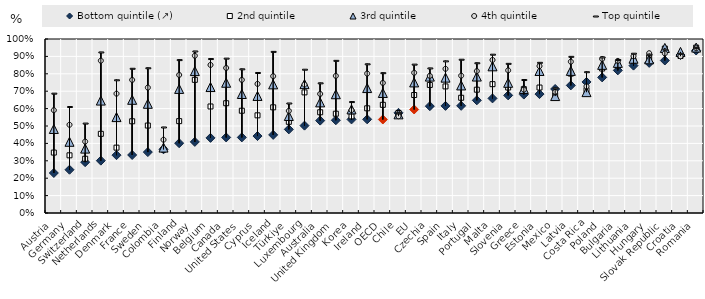
| Category | Bottom quintile (↗) | 2nd quintile | 3rd quintile | 4th quintile | Top quintile |
|---|---|---|---|---|---|
| Austria | 0.23 | 0.347 | 0.483 | 0.591 | 0.689 |
| Germany | 0.249 | 0.331 | 0.409 | 0.507 | 0.612 |
| Switzerland | 0.292 | 0.312 | 0.37 | 0.411 | 0.517 |
| Netherlands | 0.301 | 0.455 | 0.646 | 0.875 | 0.925 |
| Denmark | 0.332 | 0.376 | 0.551 | 0.686 | 0.766 |
| France | 0.333 | 0.527 | 0.651 | 0.765 | 0.832 |
| Sweden | 0.35 | 0.503 | 0.628 | 0.721 | 0.835 |
| Colombia | 0.366 | 0.365 | 0.376 | 0.421 | 0.494 |
| Finland | 0.401 | 0.528 | 0.713 | 0.794 | 0.882 |
| Norway | 0.409 | 0.765 | 0.816 | 0.904 | 0.931 |
| Belgium | 0.432 | 0.612 | 0.724 | 0.851 | 0.888 |
| Canada | 0.434 | 0.631 | 0.749 | 0.834 | 0.89 |
| United States | 0.434 | 0.588 | 0.684 | 0.765 | 0.829 |
| Cyprus | 0.442 | 0.561 | 0.673 | 0.742 | 0.808 |
| Iceland | 0.449 | 0.607 | 0.739 | 0.786 | 0.929 |
| Türkiye | 0.481 | 0.524 | 0.558 | 0.587 | 0.632 |
| Luxembourg | 0.502 | 0.693 | 0.741 | 0.738 | 0.826 |
| Australia | 0.531 | 0.579 | 0.636 | 0.684 | 0.748 |
| United Kingdom | 0.533 | 0.571 | 0.683 | 0.788 | 0.877 |
| Korea | 0.538 | 0.555 | 0.595 | 0.591 | 0.64 |
| Ireland | 0.538 | 0.602 | 0.718 | 0.801 | 0.857 |
| OECD | 0.537 | 0.622 | 0.69 | 0.748 | 0.806 |
| Chile | 0.576 | 0.575 | 0.567 | 0.556 | 0.576 |
| EU | 0.595 | 0.678 | 0.75 | 0.806 | 0.856 |
| Czechia | 0.614 | 0.736 | 0.784 | 0.788 | 0.834 |
| Spain | 0.616 | 0.727 | 0.778 | 0.829 | 0.874 |
| Italy | 0.616 | 0.662 | 0.733 | 0.789 | 0.884 |
| Portugal | 0.648 | 0.709 | 0.784 | 0.816 | 0.863 |
| Malta | 0.659 | 0.74 | 0.843 | 0.88 | 0.913 |
| Slovenia | 0.676 | 0.721 | 0.748 | 0.82 | 0.86 |
| Greece | 0.681 | 0.712 | 0.713 | 0.709 | 0.767 |
| Estonia | 0.683 | 0.721 | 0.816 | 0.844 | 0.866 |
| Mexico | 0.713 | 0.676 | 0.672 | 0.696 | 0.72 |
| Latvia | 0.733 | 0.801 | 0.817 | 0.87 | 0.9 |
| Costa Rica | 0.753 | 0.705 | 0.695 | 0.728 | 0.812 |
| Poland | 0.779 | 0.83 | 0.851 | 0.885 | 0.897 |
| Bulgaria | 0.82 | 0.848 | 0.863 | 0.874 | 0.882 |
| Lithuania | 0.847 | 0.874 | 0.887 | 0.901 | 0.918 |
| Hungary | 0.863 | 0.894 | 0.884 | 0.918 | 0.913 |
| Slovak Republic | 0.876 | 0.945 | 0.949 | 0.917 | 0.941 |
| Croatia | 0.908 | 0.903 | 0.926 | 0.901 | 0.918 |
| Romania | 0.934 | 0.951 | 0.951 | 0.947 | 0.952 |